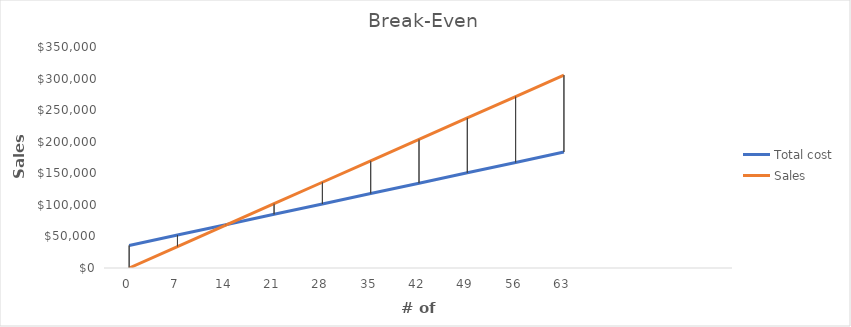
| Category | Total cost | Sales |
|---|---|---|
| 0.0 | 35750 | 0 |
| 7.0 | 52181.8 | 33950 |
| 14.0 | 68613.6 | 67900 |
| 21.0 | 85045.4 | 101850 |
| 28.0 | 101477.2 | 135800 |
| 35.0 | 117909 | 169750 |
| 42.0 | 134340.8 | 203700 |
| 49.0 | 150772.6 | 237650 |
| 56.0 | 167204.4 | 271600 |
| 63.0 | 183636.2 | 305550 |